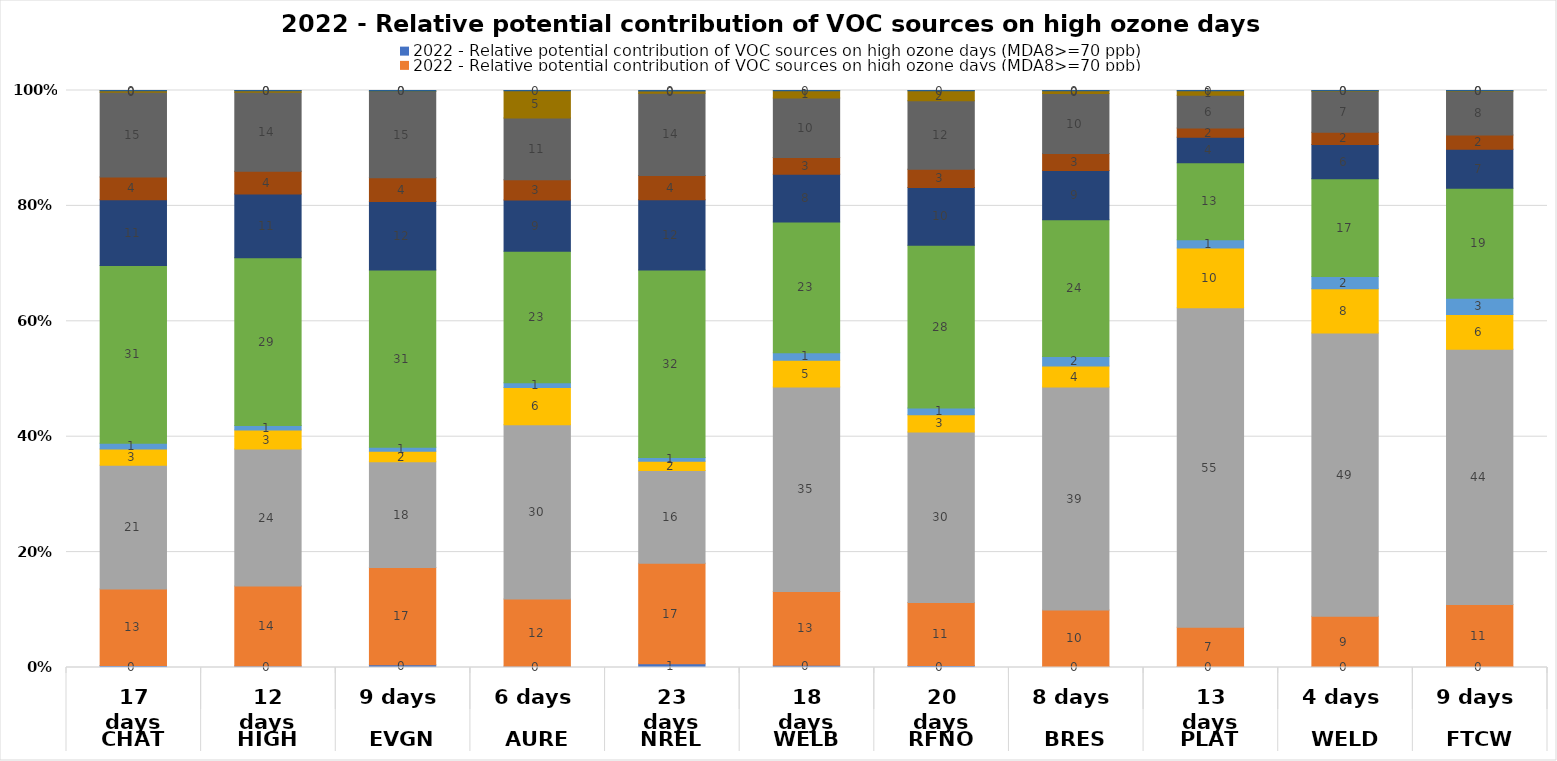
| Category | EGU Point | Non-EGU Point | O&G Area | O&G Point | O&G pre-production | Nonpoint | On-road Mobile | Other Non-road Mobile | Lawn & Garden Equipment | Airports | Rail |
|---|---|---|---|---|---|---|---|---|---|---|---|
| 0 | 0.333 | 13.254 | 21.455 | 2.832 | 0.97 | 30.822 | 11.413 | 3.94 | 14.665 | 0.253 | 0.063 |
| 1 | 0.259 | 13.855 | 23.734 | 3.319 | 0.761 | 29.106 | 11.036 | 3.954 | 13.692 | 0.227 | 0.056 |
| 2 | 0.488 | 16.822 | 18.331 | 1.82 | 0.714 | 30.708 | 11.893 | 4.084 | 14.993 | 0.077 | 0.07 |
| 3 | 0.236 | 11.636 | 30.22 | 6.439 | 0.824 | 22.787 | 8.89 | 3.499 | 10.683 | 4.724 | 0.063 |
| 4 | 0.629 | 17.417 | 16.117 | 1.593 | 0.657 | 32.489 | 12.173 | 4.19 | 14.251 | 0.406 | 0.077 |
| 5 | 0.399 | 12.776 | 35.457 | 4.614 | 1.32 | 22.646 | 8.259 | 2.922 | 10.32 | 1.227 | 0.06 |
| 6 | 0.343 | 10.919 | 29.534 | 2.995 | 1.168 | 28.24 | 10 | 3.157 | 11.884 | 1.697 | 0.061 |
| 7 | 0.171 | 9.81 | 38.615 | 3.653 | 1.657 | 23.693 | 8.533 | 2.943 | 10.39 | 0.484 | 0.052 |
| 8 | 0.182 | 6.777 | 55.389 | 10.369 | 1.409 | 13.373 | 4.39 | 1.628 | 5.639 | 0.805 | 0.038 |
| 9 | 0.07 | 8.834 | 49.066 | 7.677 | 2.122 | 16.945 | 5.917 | 2.135 | 7.088 | 0.099 | 0.049 |
| 10 | 0.139 | 10.782 | 44.23 | 6.037 | 2.807 | 19.049 | 6.78 | 2.459 | 7.579 | 0.081 | 0.058 |